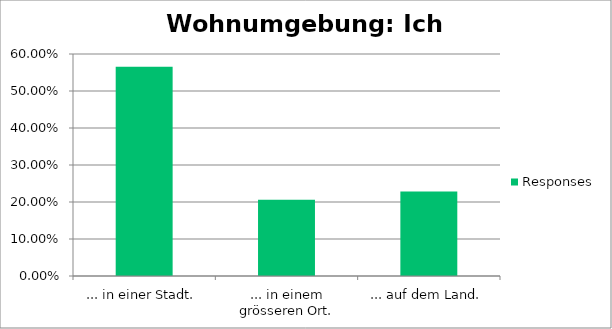
| Category | Responses |
|---|---|
| ... in einer Stadt. | 0.566 |
| ... in einem grösseren Ort. | 0.206 |
| ... auf dem Land. | 0.228 |